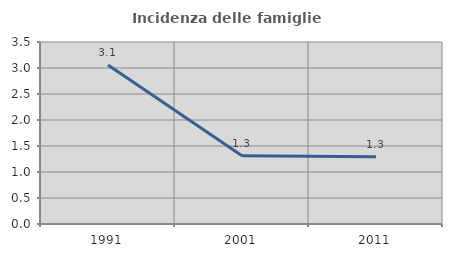
| Category | Incidenza delle famiglie numerose |
|---|---|
| 1991.0 | 3.057 |
| 2001.0 | 1.312 |
| 2011.0 | 1.293 |